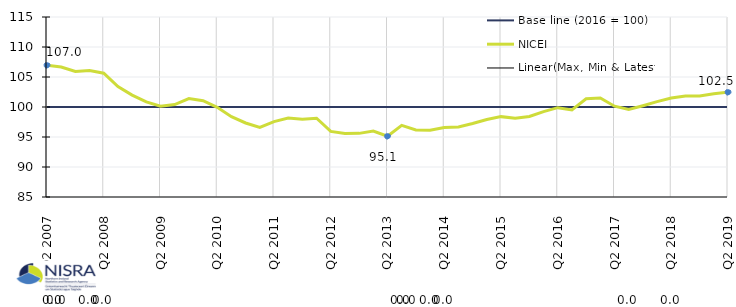
| Category | Base line (2016 = 100) | NICEI | Max, Min & Latest Q |
|---|---|---|---|
| Q2 2007 | 100 | 106.962 | 106.962 |
|  | 100 | 106.664 | 0 |
|  | 100 | 105.914 | 0 |
|  | 100 | 106.087 | 0 |
| Q2 2008 | 100 | 105.638 | 0 |
|  | 100 | 103.407 | 0 |
|  | 100 | 101.989 | 0 |
|  | 100 | 100.854 | 0 |
| Q2 2009 | 100 | 100.136 | 0 |
|  | 100 | 100.411 | 0 |
|  | 100 | 101.412 | 0 |
|  | 100 | 101.043 | 0 |
| Q2 2010 | 100 | 99.943 | 0 |
|  | 100 | 98.383 | 0 |
|  | 100 | 97.338 | 0 |
|  | 100 | 96.582 | 0 |
| Q2 2011 | 100 | 97.555 | 0 |
|  | 100 | 98.167 | 0 |
|  | 100 | 97.942 | 0 |
|  | 100 | 98.132 | 0 |
| Q2 2012 | 100 | 95.931 | 0 |
|  | 100 | 95.576 | 0 |
|  | 100 | 95.604 | 0 |
|  | 100 | 96.002 | 0 |
| Q2 2013 | 100 | 95.135 | 95.135 |
|  | 100 | 96.931 | 0 |
|  | 100 | 96.165 | 0 |
|  | 100 | 96.125 | 0 |
| Q2 2014 | 100 | 96.586 | 0 |
|  | 100 | 96.663 | 0 |
|  | 100 | 97.255 | 0 |
|  | 100 | 97.926 | 0 |
| Q2 2015 | 100 | 98.394 | 0 |
|  | 100 | 98.119 | 0 |
|  | 100 | 98.424 | 0 |
|  | 100 | 99.227 | 0 |
| Q2 2016 | 100 | 99.888 | 0 |
|  | 100 | 99.506 | 0 |
|  | 100 | 101.379 | 0 |
|  | 100 | 101.491 | 0 |
| Q2 2017 | 100 | 100.134 | 0 |
|  | 100 | 99.579 | 0 |
|  | 100 | 100.218 | 0 |
|  | 100 | 100.889 | 0 |
| Q2 2018 | 100 | 101.487 | 0 |
|  | 100 | 101.848 | 0 |
|  | 100 | 101.842 | 0 |
|  | 100 | 102.208 | 0 |
| Q2 2019 | 100 | 102.467 | 102.467 |